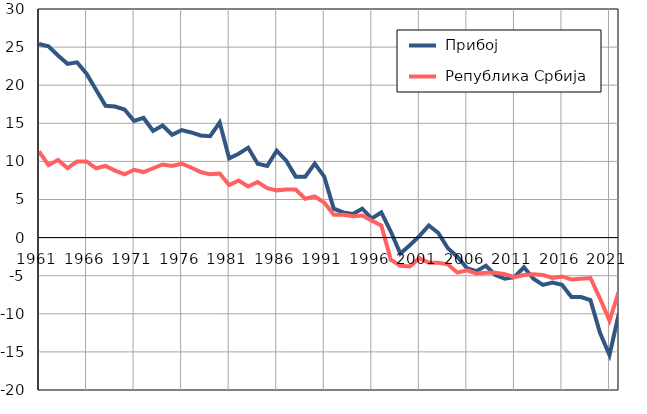
| Category |  Прибој |  Република Србија |
|---|---|---|
| 1961.0 | 25.4 | 11.3 |
| 1962.0 | 25.1 | 9.5 |
| 1963.0 | 23.9 | 10.2 |
| 1964.0 | 22.8 | 9.1 |
| 1965.0 | 23 | 10 |
| 1966.0 | 21.5 | 10 |
| 1967.0 | 19.4 | 9.1 |
| 1968.0 | 17.3 | 9.4 |
| 1969.0 | 17.2 | 8.8 |
| 1970.0 | 16.8 | 8.3 |
| 1971.0 | 15.3 | 8.9 |
| 1972.0 | 15.7 | 8.6 |
| 1973.0 | 14 | 9.1 |
| 1974.0 | 14.7 | 9.6 |
| 1975.0 | 13.5 | 9.4 |
| 1976.0 | 14.1 | 9.7 |
| 1977.0 | 13.8 | 9.2 |
| 1978.0 | 13.4 | 8.6 |
| 1979.0 | 13.3 | 8.3 |
| 1980.0 | 15.1 | 8.4 |
| 1981.0 | 10.4 | 6.9 |
| 1982.0 | 11 | 7.5 |
| 1983.0 | 11.8 | 6.7 |
| 1984.0 | 9.7 | 7.3 |
| 1985.0 | 9.4 | 6.5 |
| 1986.0 | 11.4 | 6.2 |
| 1987.0 | 10.1 | 6.3 |
| 1988.0 | 8 | 6.3 |
| 1989.0 | 8 | 5.1 |
| 1990.0 | 9.7 | 5.4 |
| 1991.0 | 8 | 4.6 |
| 1992.0 | 3.8 | 3 |
| 1993.0 | 3.3 | 3 |
| 1994.0 | 3.1 | 2.8 |
| 1995.0 | 3.8 | 2.9 |
| 1996.0 | 2.5 | 2.2 |
| 1997.0 | 3.3 | 1.6 |
| 1998.0 | 0.8 | -2.9 |
| 1999.0 | -2.1 | -3.7 |
| 2000.0 | -1 | -3.8 |
| 2001.0 | 0.2 | -2.7 |
| 2002.0 | 1.6 | -3.3 |
| 2003.0 | 0.6 | -3.3 |
| 2004.0 | -1.4 | -3.5 |
| 2005.0 | -2.5 | -4.6 |
| 2006.0 | -4 | -4.3 |
| 2007.0 | -4.4 | -4.7 |
| 2008.0 | -3.7 | -4.6 |
| 2009.0 | -4.9 | -4.6 |
| 2010.0 | -5.4 | -4.8 |
| 2011.0 | -5.2 | -5.2 |
| 2012.0 | -3.9 | -4.9 |
| 2013.0 | -5.4 | -4.8 |
| 2014.0 | -6.2 | -4.9 |
| 2015.0 | -5.9 | -5.3 |
| 2016.0 | -6.2 | -5.1 |
| 2017.0 | -7.8 | -5.5 |
| 2018.0 | -7.8 | -5.4 |
| 2019.0 | -8.2 | -5.3 |
| 2020.0 | -12.5 | -8 |
| 2021.0 | -15.4 | -10.9 |
| 2022.0 | -9.9 | -7 |